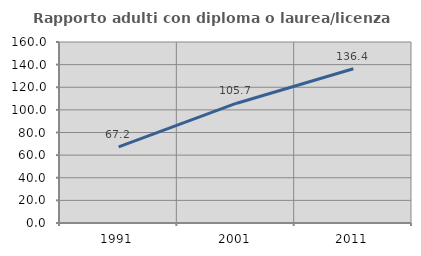
| Category | Rapporto adulti con diploma o laurea/licenza media  |
|---|---|
| 1991.0 | 67.224 |
| 2001.0 | 105.686 |
| 2011.0 | 136.369 |